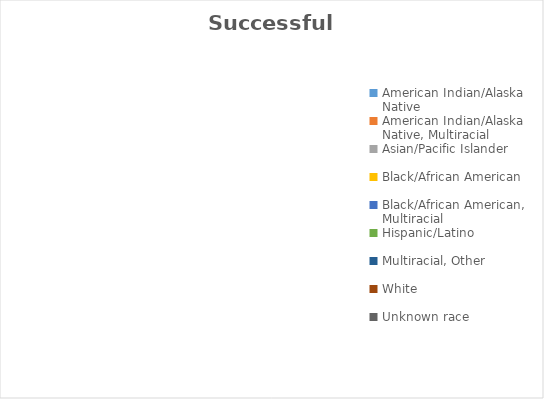
| Category | Successful Outcome |
|---|---|
| American Indian/Alaska Native  | 0 |
| American Indian/Alaska Native, Multiracial | 0 |
| Asian/Pacific Islander | 0 |
| Black/African American | 0 |
| Black/African American, Multiracial | 0 |
| Hispanic/Latino  | 0 |
| Multiracial, Other | 0 |
| White  | 0 |
| Unknown race | 0 |